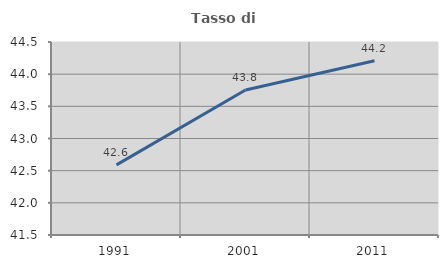
| Category | Tasso di occupazione   |
|---|---|
| 1991.0 | 42.59 |
| 2001.0 | 43.755 |
| 2011.0 | 44.208 |